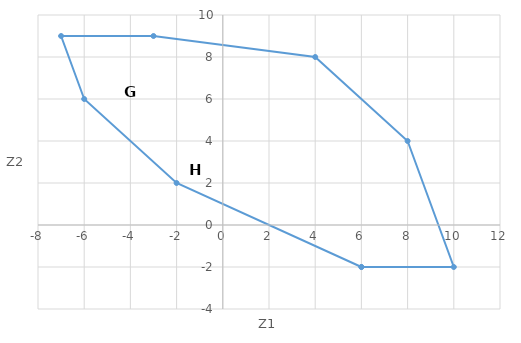
| Category | Series 0 |
|---|---|
| 6.0 | -2 |
| 10.0 | -2 |
| 8.0 | 4 |
| 4.0 | 8 |
| -3.0 | 9 |
| -7.0 | 9 |
| -6.0 | 6 |
| -2.0 | 2 |
| 6.0 | -2 |